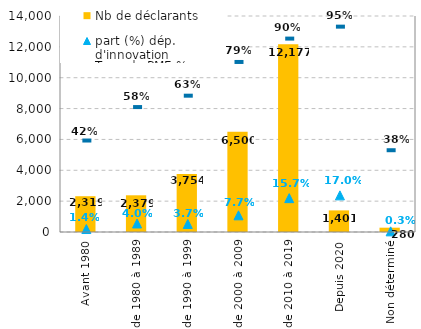
| Category | Nb de déclarants |
|---|---|
| Avant 1980 | 2319 |
| de 1980 à 1989 | 2379 |
| de 1990 à 1999 | 3754 |
| de 2000 à 2009 | 6500 |
| de 2010 à 2019 | 12177 |
| Depuis 2020 | 1401 |
| Non déterminé | 280 |